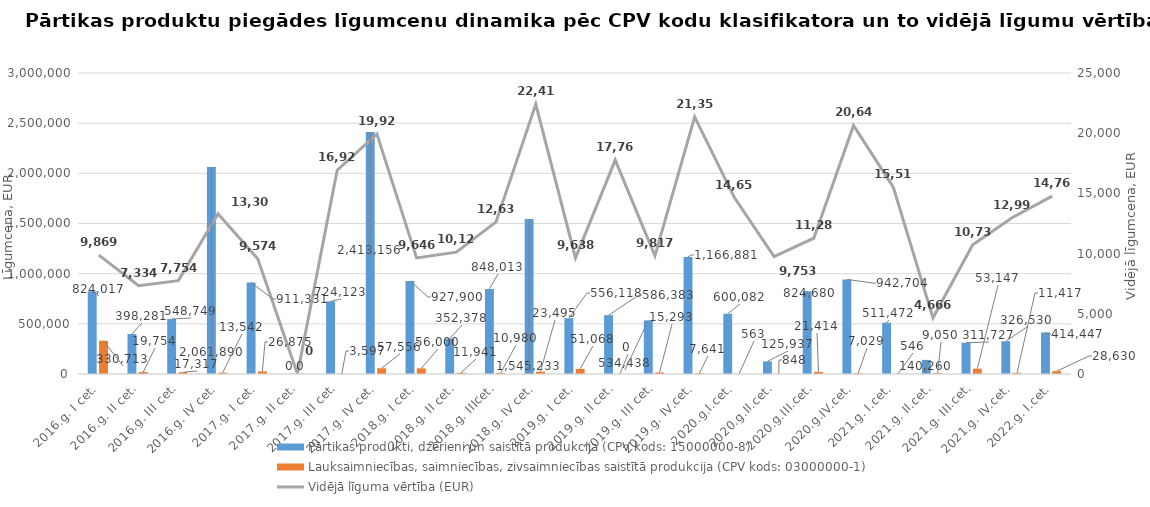
| Category | Pārtikas produkti, dzērieni un saistītā produkcija (CPV kods: 15000000-8) | Lauksaimniecības, saimniecības, zivsaimniecības saistītā produkcija (CPV kods: 03000000-1) |
|---|---|---|
| 2016.g. I cet. | 824017 | 330713 |
| 2016.g. II cet. | 398281 | 19754 |
| 2016.g. III cet. | 548749.01 | 17317 |
| 2016.g. IV cet. | 2061890 | 13542 |
| 2017.g. I cet. | 911330.81 | 26874.91 |
| 2017.g. II cet. | 0 | 0 |
| 2017.g. III cet. | 724123.07 | 3596.6 |
| 2017.g. IV cet. | 2413156 | 57556 |
| 2018.g. I cet. | 927900 | 56000 |
| 2018.g. II cet. | 352378 | 11941 |
| 2018.g. IIIcet. | 848013 | 10980 |
| 2018.g. IV cet. | 1545233 | 23495 |
| 2019.g. I cet. | 556118 | 51068 |
| 2019.g. II cet. | 586383 | 0 |
| 2019.g. III cet. | 534438 | 15293 |
| 2019.g. IV.cet. | 1166881 | 7641 |
| 2020.g.I.cet. | 600082 | 563 |
| 2020.g.II.cet. | 125937 | 848 |
| 2020.g.III.cet. | 824680 | 21414 |
| 2020.g.IV.cet. | 942704 | 7029 |
| 2021.g. I.cet. | 511472 | 546 |
| 2021.g. II.cet. | 140260 | 9050 |
| 2021.g. III.cet. | 311727 | 53147 |
| 2021.g. IV.cet. | 326530 | 11417 |
| 2022.g. I.cet. | 414447 | 28630 |